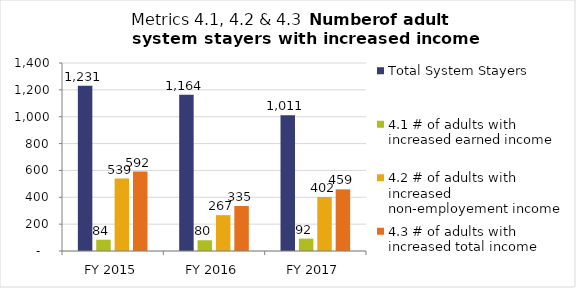
| Category | Total System Stayers | 4.1 # of adults with increased earned income | 4.2 # of adults with increased non-employement income | 4.3 # of adults with increased total income |
|---|---|---|---|---|
| FY 2015 | 1231 | 84 | 539 | 592 |
| FY 2016 | 1164 | 80 | 267 | 335 |
| FY 2017 | 1011 | 92 | 402 | 459 |